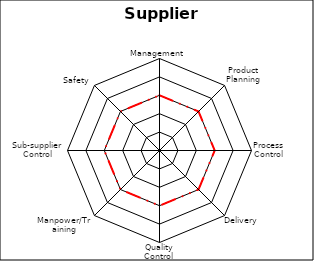
| Category | Series 0 | Series 1 |
|---|---|---|
| 0 | 0 | 3 |
| 1 | 0 | 3 |
| 2 | 0 | 3 |
| 3 | 0 | 3 |
| 4 | 0 | 3 |
| 5 | 0 | 3 |
| 6 | 0 | 3 |
| 7 | 0 | 3 |